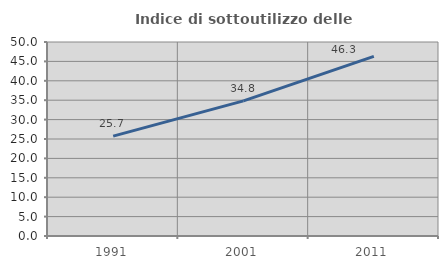
| Category | Indice di sottoutilizzo delle abitazioni  |
|---|---|
| 1991.0 | 25.729 |
| 2001.0 | 34.82 |
| 2011.0 | 46.281 |